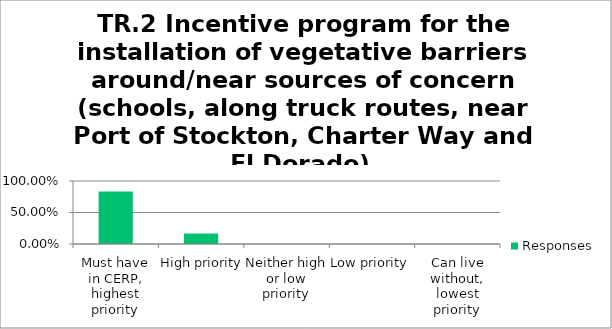
| Category | Responses |
|---|---|
| Must have in CERP, highest priority | 0.833 |
| High priority | 0.167 |
| Neither high or low priority | 0 |
| Low priority | 0 |
| Can live without, lowest priority | 0 |